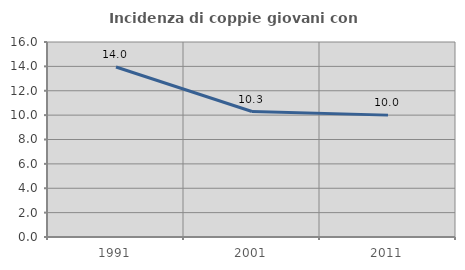
| Category | Incidenza di coppie giovani con figli |
|---|---|
| 1991.0 | 13.951 |
| 2001.0 | 10.296 |
| 2011.0 | 10 |